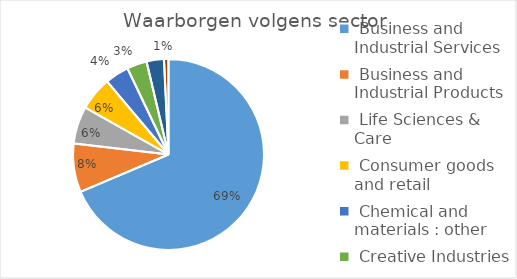
| Category | Series 0 |
|---|---|
| Business and Industrial Services | 135691093.75 |
| Business and Industrial Products | 16300415.368 |
| Life Sciences & Care | 12500000 |
| Consumer goods and retail | 11278070.964 |
| Chemical and materials : other | 7996149 |
| Creative Industries | 6686416.625 |
| Construction | 5814639.774 |
| Financial institutions and services | 1500000 |